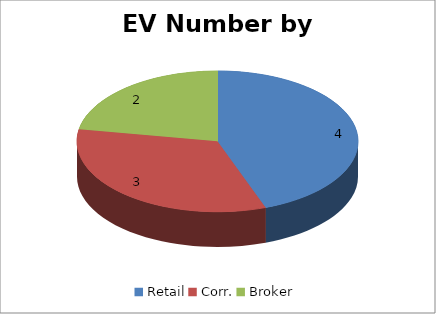
| Category | EV Number |
|---|---|
| Retail | 4 |
| Corr. | 3 |
| Broker | 2 |